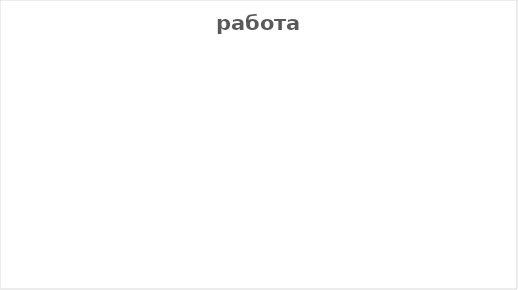
| Category | Series 0 |
|---|---|
| Гедонизм | 0 |
| Благодарность | 0 |
| Самодеструкция | 0 |